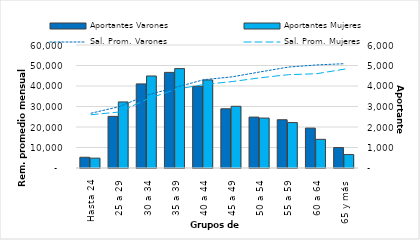
| Category | Aportantes Varones | Aportantes Mujeres |
|---|---|---|
| 0 | 523 | 481 |
| 1 | 2518 | 3223 |
| 2 | 4103 | 4489 |
| 3 | 4664 | 4848 |
| 4 | 3986 | 4296 |
| 5 | 2888 | 3010 |
| 6 | 2483 | 2436 |
| 7 | 2354 | 2217 |
| 8 | 1946 | 1398 |
| 9 | 997 | 655 |